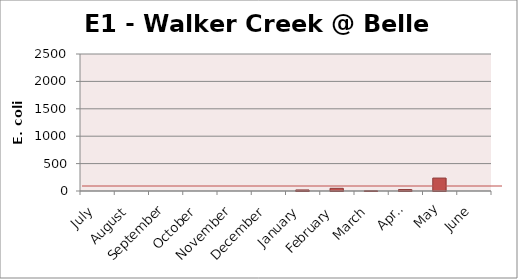
| Category | E. coli MPN |
|---|---|
| July | 0 |
| August | 0 |
| September | 0 |
| October | 0 |
| November | 0 |
| December | 0 |
| January | 19.3 |
| February | 48.8 |
| March | 3.1 |
| April | 26.2 |
| May | 235.9 |
| June | 0 |